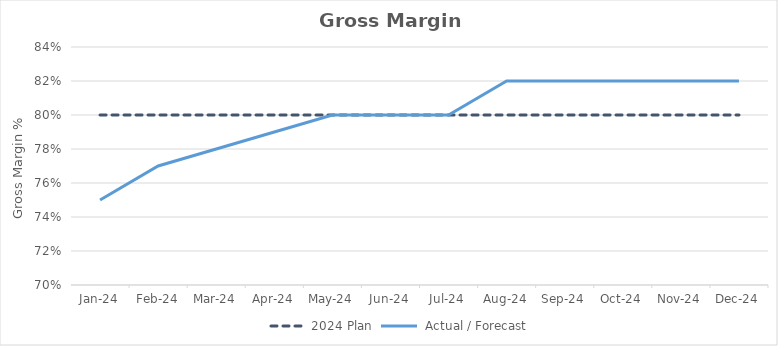
| Category | 2024 Plan |  Actual / Forecast |
|---|---|---|
| 2024-01-31 | 0.8 | 0.75 |
| 2024-02-29 | 0.8 | 0.77 |
| 2024-03-31 | 0.8 | 0.78 |
| 2024-04-30 | 0.8 | 0.79 |
| 2024-05-31 | 0.8 | 0.8 |
| 2024-06-30 | 0.8 | 0.8 |
| 2024-07-31 | 0.8 | 0.8 |
| 2024-08-31 | 0.8 | 0.82 |
| 2024-09-30 | 0.8 | 0.82 |
| 2024-10-31 | 0.8 | 0.82 |
| 2024-11-30 | 0.8 | 0.82 |
| 2024-12-31 | 0.8 | 0.82 |